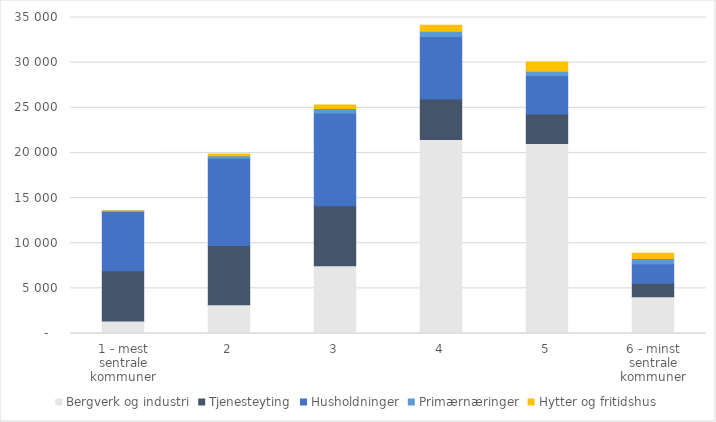
| Category | Bergverk og industri | Tjenesteyting | Husholdninger | Primærnæringer | Hytter og fritidshus |
|---|---|---|---|---|---|
| 1 - mest sentrale kommuner | 1382.1 | 5578.5 | 6589.6 | 13.2 | 7.8 |
| 2 | 3192.4 | 6544.1 | 9666 | 289.3 | 175.9 |
| 3 | 7516.7 | 6631.5 | 10271 | 502 | 386.3 |
| 4 | 21490 | 4496.5 | 6895.9 | 603.4 | 656.7 |
| 5 | 21030.5 | 3286.1 | 4254.7 | 472.8 | 1017.1 |
| 6 - minst sentrale kommuner | 4066.6 | 1505.9 | 2154.9 | 590.2 | 575.4 |